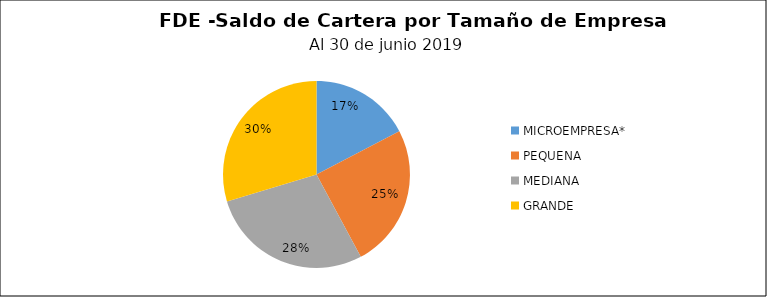
| Category | Saldo | Créditos |
|---|---|---|
| MICROEMPRESA* | 8.537 | 510 |
| PEQUENA | 12.226 | 139 |
| MEDIANA | 13.892 | 39 |
| GRANDE | 14.606 | 27 |